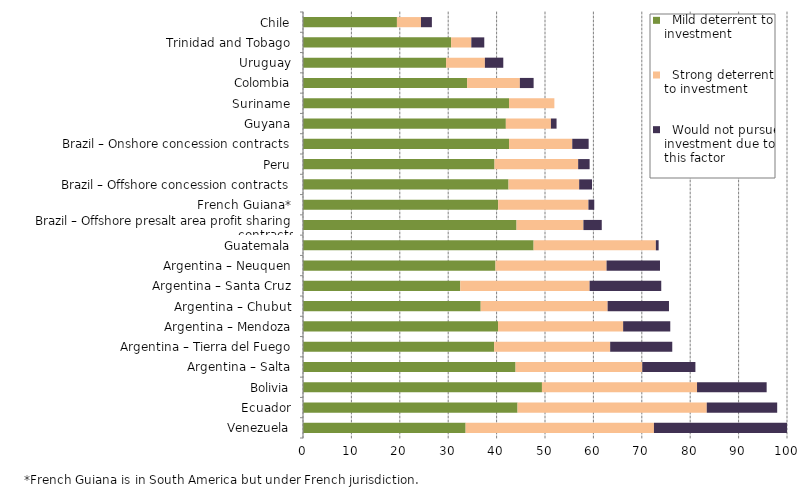
| Category |   Mild deterrent to investment |   Strong deterrent to investment |   Would not pursue investment due to this factor |
|---|---|---|---|
| Venezuela | 33.599 | 38.911 | 27.49 |
| Ecuador | 44.326 | 39.098 | 14.548 |
| Bolivia | 49.37 | 32.041 | 14.386 |
| Argentina – Salta | 43.916 | 26.18 | 10.979 |
| Argentina – Tierra del Fuego | 39.497 | 23.968 | 12.828 |
| Argentina – Mendoza | 40.292 | 25.854 | 9.737 |
| Argentina – Chubut | 36.715 | 26.225 | 12.675 |
| Argentina – Santa Cruz | 32.496 | 26.719 | 14.804 |
| Argentina – Neuquen | 39.771 | 22.951 | 11.038 |
| Guatemala | 47.646 | 25.258 | 0.574 |
| Brazil – Offshore presalt area profit sharing contracts | 44.123 | 13.816 | 3.788 |
| French Guiana* | 40.319 | 18.655 | 1.204 |
| Brazil – Offshore concession contracts | 42.463 | 14.597 | 2.654 |
| Peru | 39.572 | 17.278 | 2.369 |
| Brazil – Onshore concession contracts | 42.571 | 13.062 | 3.386 |
| Guyana | 41.911 | 9.314 | 1.164 |
| Suriname | 42.564 | 9.372 | 0 |
| Colombia | 33.913 | 10.894 | 2.842 |
| Uruguay | 29.559 | 8.023 | 3.8 |
| Trinidad and Tobago | 30.599 | 4.18 | 2.675 |
| Chile | 19.407 | 4.965 | 2.257 |